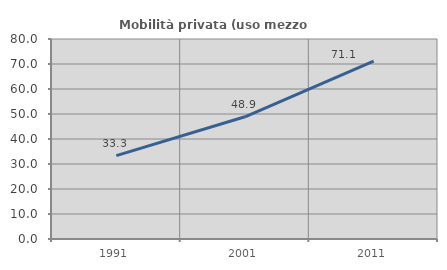
| Category | Mobilità privata (uso mezzo privato) |
|---|---|
| 1991.0 | 33.333 |
| 2001.0 | 48.889 |
| 2011.0 | 71.111 |